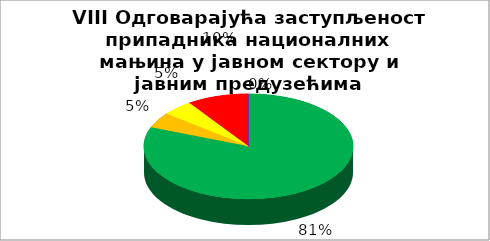
| Category | VIII Одговарајућа заступљеност припадника националних мањина у јавном сектору и јавним предузећима |
|---|---|
| 0 | 0.81 |
| 1 | 0.048 |
| 2 | 0.048 |
| 3 | 0.095 |
| 4 | 0 |